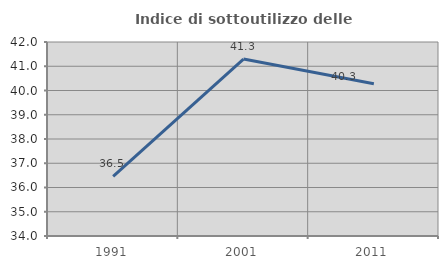
| Category | Indice di sottoutilizzo delle abitazioni  |
|---|---|
| 1991.0 | 36.456 |
| 2001.0 | 41.295 |
| 2011.0 | 40.281 |